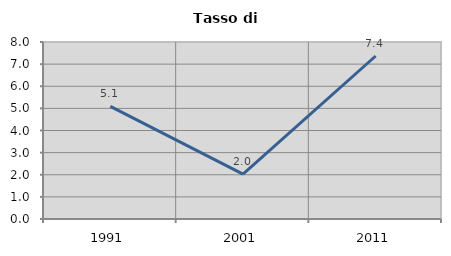
| Category | Tasso di disoccupazione   |
|---|---|
| 1991.0 | 5.089 |
| 2001.0 | 2.026 |
| 2011.0 | 7.367 |